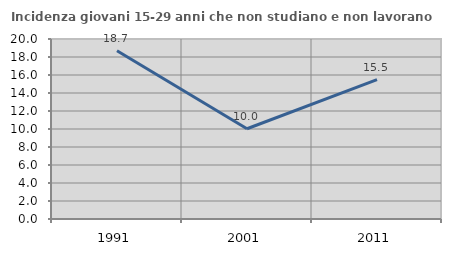
| Category | Incidenza giovani 15-29 anni che non studiano e non lavorano  |
|---|---|
| 1991.0 | 18.701 |
| 2001.0 | 10.026 |
| 2011.0 | 15.482 |